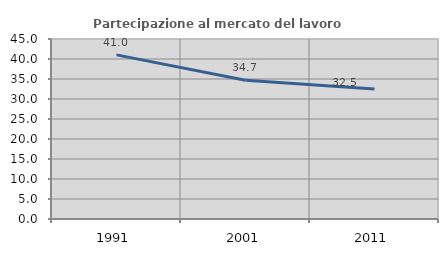
| Category | Partecipazione al mercato del lavoro  femminile |
|---|---|
| 1991.0 | 41.028 |
| 2001.0 | 34.68 |
| 2011.0 | 32.476 |